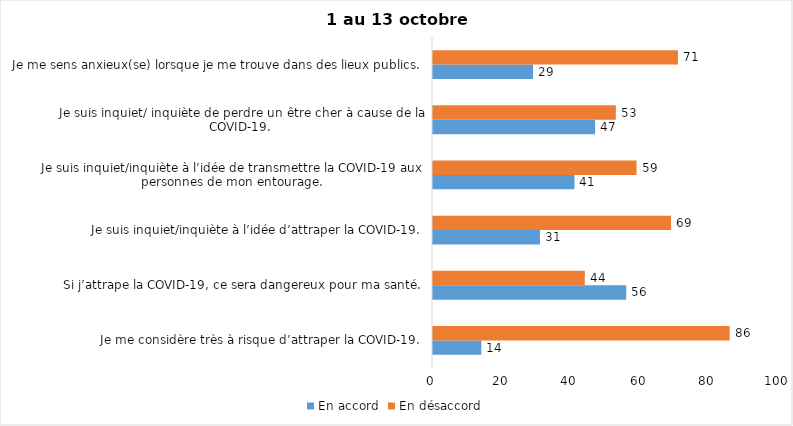
| Category | En accord | En désaccord |
|---|---|---|
| Je me considère très à risque d’attraper la COVID-19. | 14 | 86 |
| Si j’attrape la COVID-19, ce sera dangereux pour ma santé. | 56 | 44 |
| Je suis inquiet/inquiète à l’idée d’attraper la COVID-19. | 31 | 69 |
| Je suis inquiet/inquiète à l’idée de transmettre la COVID-19 aux personnes de mon entourage. | 41 | 59 |
| Je suis inquiet/ inquiète de perdre un être cher à cause de la COVID-19. | 47 | 53 |
| Je me sens anxieux(se) lorsque je me trouve dans des lieux publics. | 29 | 71 |